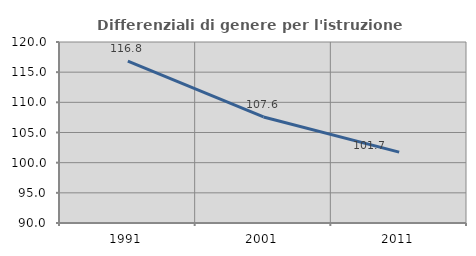
| Category | Differenziali di genere per l'istruzione superiore |
|---|---|
| 1991.0 | 116.817 |
| 2001.0 | 107.572 |
| 2011.0 | 101.742 |